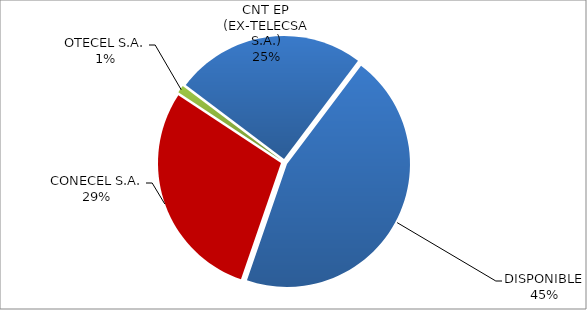
| Category | CÓDIGO DE RED 96 |
|---|---|
| CONECEL S.A. | 0.29 |
| OTECEL S.A. | 0.01 |
| CNT EP (EX-TELECSA S.A.) | 0.25 |
| DISPONIBLE | 0.45 |